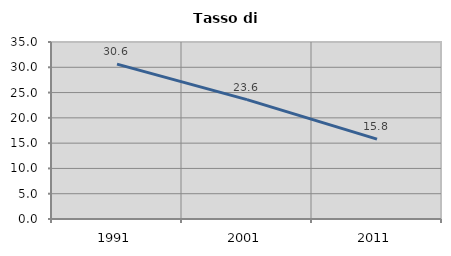
| Category | Tasso di disoccupazione   |
|---|---|
| 1991.0 | 30.624 |
| 2001.0 | 23.611 |
| 2011.0 | 15.804 |